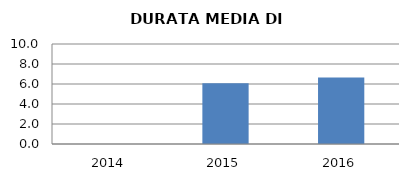
| Category | 2014 2015 2016 |
|---|---|
| 2014.0 | 0 |
| 2015.0 | 6.087 |
| 2016.0 | 6.645 |